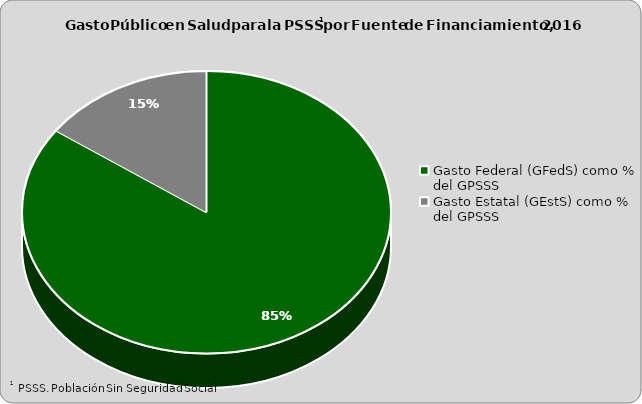
| Category | Series 0 |
|---|---|
| Gasto Federal (GFedS) como % del GPSSS | 84.822 |
| Gasto Estatal (GEstS) como % del GPSSS | 15.178 |